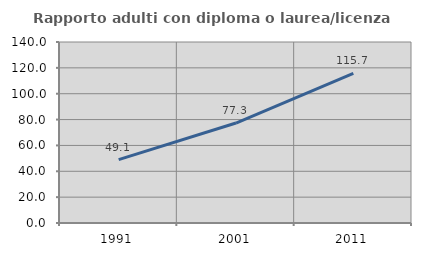
| Category | Rapporto adulti con diploma o laurea/licenza media  |
|---|---|
| 1991.0 | 49.067 |
| 2001.0 | 77.307 |
| 2011.0 | 115.689 |